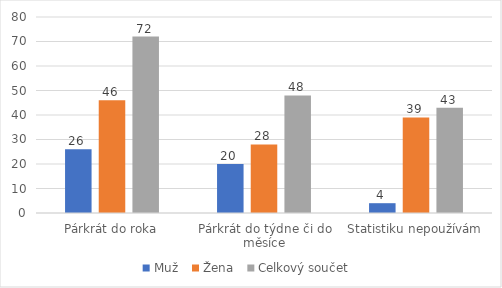
| Category | Muž | Žena | Celkový součet |
|---|---|---|---|
| Párkrát do roka | 26 | 46 | 72 |
| Párkrát do týdne či do měsíce | 20 | 28 | 48 |
| Statistiku nepoužívám | 4 | 39 | 43 |